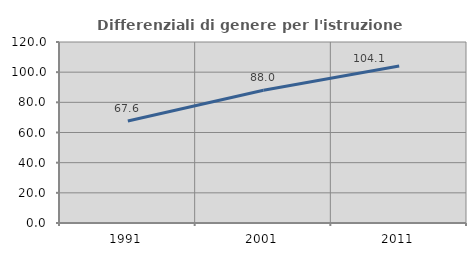
| Category | Differenziali di genere per l'istruzione superiore |
|---|---|
| 1991.0 | 67.59 |
| 2001.0 | 88.02 |
| 2011.0 | 104.139 |